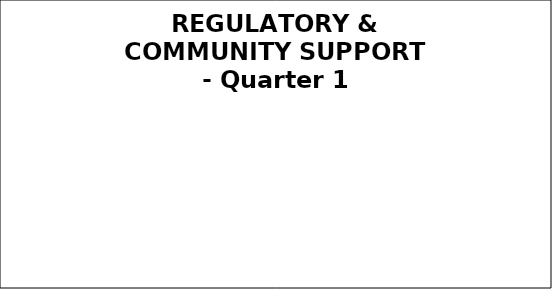
| Category | Q1 |
|---|---|
| Green | 0 |
| Amber | 0 |
| Red | 0 |